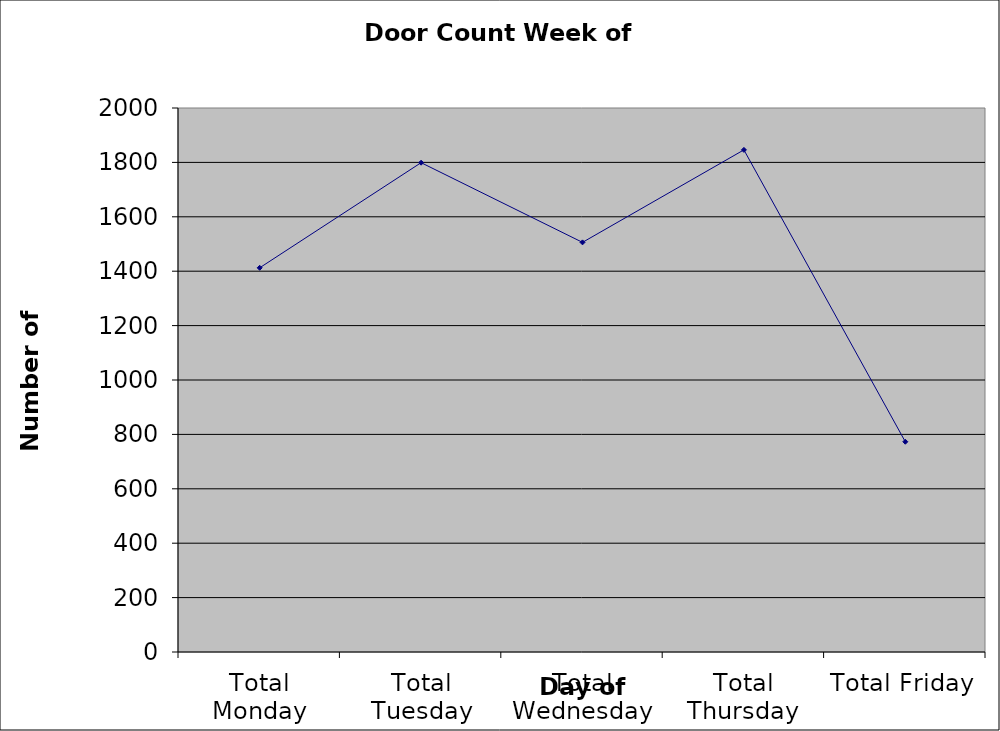
| Category | Series 0 |
|---|---|
| Total Monday | 1412.5 |
| Total Tuesday | 1799 |
| Total Wednesday | 1506 |
| Total Thursday | 1846 |
| Total Friday | 773 |